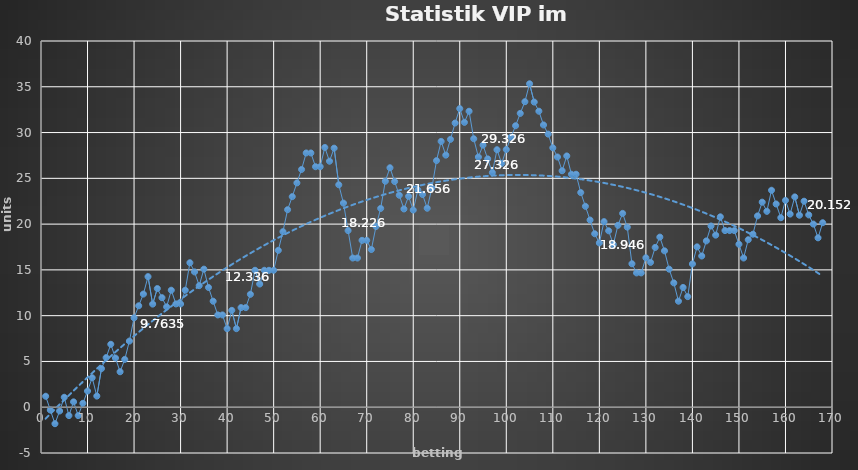
| Category | Series 0 |
|---|---|
| 0 | 1.2 |
| 1 | -0.3 |
| 2 | -1.8 |
| 3 | -0.412 |
| 4 | 1.088 |
| 5 | -0.912 |
| 6 | 0.588 |
| 7 | -0.912 |
| 8 | 0.426 |
| 9 | 1.764 |
| 10 | 3.219 |
| 11 | 1.219 |
| 12 | 4.219 |
| 13 | 5.419 |
| 14 | 6.874 |
| 15 | 5.374 |
| 16 | 3.874 |
| 17 | 5.224 |
| 18 | 7.224 |
| 19 | 9.764 |
| 20 | 11.079 |
| 21 | 12.359 |
| 22 | 14.263 |
| 23 | 11.263 |
| 24 | 12.963 |
| 25 | 11.963 |
| 26 | 10.963 |
| 27 | 12.781 |
| 28 | 11.281 |
| 29 | 11.281 |
| 30 | 12.781 |
| 31 | 15.781 |
| 32 | 14.781 |
| 33 | 13.281 |
| 34 | 15.081 |
| 35 | 13.081 |
| 36 | 11.581 |
| 37 | 10.081 |
| 38 | 10.081 |
| 39 | 8.581 |
| 40 | 10.581 |
| 41 | 8.581 |
| 42 | 10.881 |
| 43 | 10.881 |
| 44 | 12.336 |
| 45 | 14.956 |
| 46 | 13.456 |
| 47 | 14.956 |
| 48 | 14.956 |
| 49 | 14.956 |
| 50 | 17.136 |
| 51 | 19.176 |
| 52 | 21.576 |
| 53 | 23.001 |
| 54 | 24.501 |
| 55 | 25.971 |
| 56 | 27.771 |
| 57 | 27.771 |
| 58 | 26.271 |
| 59 | 26.271 |
| 60 | 28.371 |
| 61 | 26.871 |
| 62 | 28.296 |
| 63 | 24.296 |
| 64 | 22.296 |
| 65 | 19.296 |
| 66 | 16.296 |
| 67 | 16.296 |
| 68 | 18.226 |
| 69 | 18.226 |
| 70 | 17.226 |
| 71 | 19.746 |
| 72 | 21.716 |
| 73 | 24.686 |
| 74 | 26.156 |
| 75 | 24.656 |
| 76 | 23.156 |
| 77 | 21.656 |
| 78 | 23.036 |
| 79 | 21.536 |
| 80 | 23.736 |
| 81 | 23.236 |
| 82 | 21.736 |
| 83 | 23.936 |
| 84 | 26.936 |
| 85 | 29.036 |
| 86 | 27.536 |
| 87 | 29.261 |
| 88 | 31.041 |
| 89 | 32.616 |
| 90 | 31.116 |
| 91 | 32.326 |
| 92 | 29.326 |
| 93 | 27.326 |
| 94 | 28.626 |
| 95 | 27.126 |
| 96 | 25.626 |
| 97 | 28.126 |
| 98 | 26.626 |
| 99 | 28.146 |
| 100 | 29.496 |
| 101 | 30.746 |
| 102 | 32.096 |
| 103 | 33.371 |
| 104 | 35.331 |
| 105 | 33.331 |
| 106 | 32.331 |
| 107 | 30.831 |
| 108 | 29.831 |
| 109 | 28.331 |
| 110 | 27.331 |
| 111 | 25.831 |
| 112 | 27.446 |
| 113 | 25.446 |
| 114 | 25.446 |
| 115 | 23.446 |
| 116 | 21.946 |
| 117 | 20.446 |
| 118 | 18.946 |
| 119 | 17.946 |
| 120 | 20.271 |
| 121 | 19.271 |
| 122 | 17.771 |
| 123 | 19.871 |
| 124 | 21.171 |
| 125 | 19.671 |
| 126 | 15.671 |
| 127 | 14.671 |
| 128 | 14.671 |
| 129 | 16.321 |
| 130 | 15.821 |
| 131 | 17.451 |
| 132 | 18.581 |
| 133 | 17.081 |
| 134 | 15.081 |
| 135 | 13.581 |
| 136 | 11.581 |
| 137 | 13.081 |
| 138 | 12.081 |
| 139 | 15.649 |
| 140 | 17.517 |
| 141 | 16.517 |
| 142 | 18.167 |
| 143 | 19.797 |
| 144 | 18.797 |
| 145 | 20.797 |
| 146 | 19.297 |
| 147 | 19.297 |
| 148 | 19.297 |
| 149 | 17.797 |
| 150 | 16.297 |
| 151 | 18.297 |
| 152 | 18.897 |
| 153 | 20.897 |
| 154 | 22.397 |
| 155 | 21.397 |
| 156 | 23.697 |
| 157 | 22.197 |
| 158 | 20.697 |
| 159 | 22.597 |
| 160 | 21.097 |
| 161 | 22.972 |
| 162 | 20.972 |
| 163 | 22.502 |
| 164 | 21.002 |
| 165 | 20.002 |
| 166 | 18.502 |
| 167 | 20.152 |